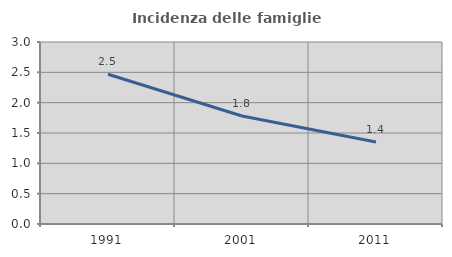
| Category | Incidenza delle famiglie numerose |
|---|---|
| 1991.0 | 2.469 |
| 2001.0 | 1.78 |
| 2011.0 | 1.351 |